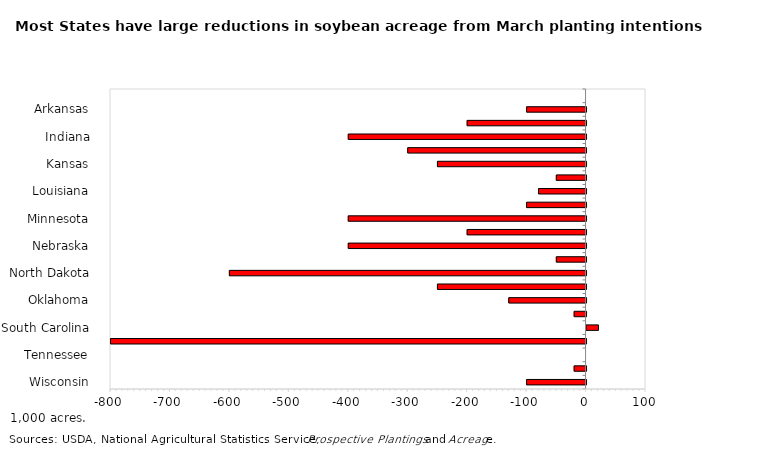
| Category | 1,000 acres |
|---|---|
| Wisconsin | -100 |
| Virginia | -20 |
| Tennessee | 0 |
| South Dakota | -800 |
| South Carolina | 20 |
| Pennsylvania | -20 |
| Oklahoma | -130 |
| Ohio | -250 |
| North Dakota | -600 |
| North Carolina | -50 |
| Nebraska | -400 |
| Missouri | -200 |
| Minnesota | -400 |
| Michigan | -100 |
| Louisiana | -80 |
| Kentucky | -50 |
| Kansas | -250 |
| Iowa | -300 |
| Indiana | -400 |
| Illinois | -200 |
| Arkansas | -100 |
| Alabama | 0 |